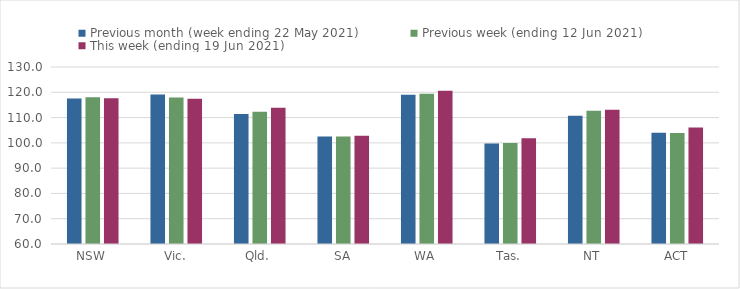
| Category | Previous month (week ending 22 May 2021) | Previous week (ending 12 Jun 2021) | This week (ending 19 Jun 2021) |
|---|---|---|---|
| NSW | 117.51 | 118.03 | 117.61 |
| Vic. | 119.13 | 117.89 | 117.48 |
| Qld. | 111.4 | 112.35 | 113.89 |
| SA | 102.49 | 102.52 | 102.84 |
| WA | 119.05 | 119.44 | 120.57 |
| Tas. | 99.77 | 99.92 | 101.85 |
| NT | 110.68 | 112.7 | 113.14 |
| ACT | 104.04 | 103.93 | 106.1 |